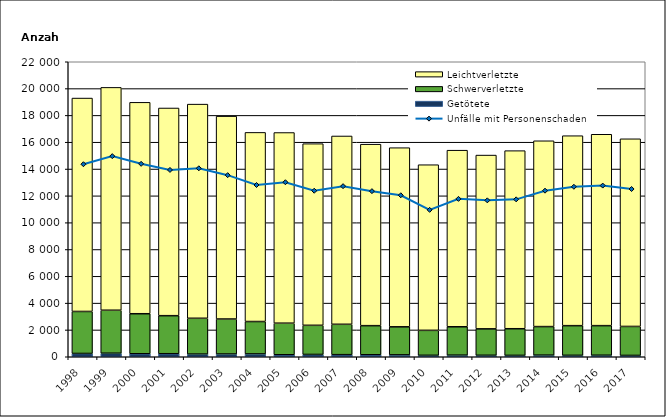
| Category | Getötete | Schwerverletzte | Leichtverletzte |
|---|---|---|---|
| 1998.0 | 245 | 3132 | 15915 |
| 1999.0 | 264 | 3205 | 16619 |
| 2000.0 | 223 | 2985 | 15767 |
| 2001.0 | 226 | 2837 | 15488 |
| 2002.0 | 199 | 2670 | 15971 |
| 2003.0 | 204 | 2611 | 15128 |
| 2004.0 | 212 | 2415 | 14104 |
| 2005.0 | 148 | 2355 | 14219 |
| 2006.0 | 172 | 2173 | 13546 |
| 2007.0 | 156 | 2265 | 14043 |
| 2008.0 | 149 | 2169 | 13535 |
| 2009.0 | 140 | 2092 | 13360 |
| 2010.0 | 108 | 1862 | 12352 |
| 2011.0 | 120 | 2116 | 13169 |
| 2012.0 | 110 | 1970 | 12961 |
| 2013.0 | 103 | 1987 | 13280 |
| 2014.0 | 121 | 2128 | 13858 |
| 2015.0 | 107 | 2211 | 14167 |
| 2016.0 | 114 | 2205 | 14274 |
| 2017.0 | 100 | 2160 | 13995 |